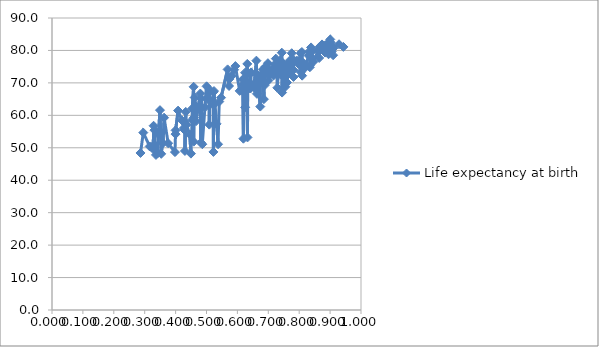
| Category | Life expectancy at birth |
|---|---|
| 0.943001086535884 | 81.097 |
| 0.928884726718224 | 81.907 |
| 0.909912675728326 | 80.734 |
| 0.909858307540323 | 78.531 |
| 0.908364866982141 | 80.654 |
| 0.908096323712948 | 81.012 |
| 0.908089883083403 | 80.557 |
| 0.905297605520119 | 79.637 |
| 0.905090521421595 | 80.414 |
| 0.90378977195844 | 81.439 |
| 0.902540799066263 | 82.338 |
| 0.900631570741602 | 83.394 |
| 0.898069322047348 | 82.759 |
| 0.897774812055868 | 81.804 |
| 0.897214078568159 | 80.642 |
| 0.894910912942129 | 78.826 |
| 0.888365794312005 | 81.618 |
| 0.88562789099183 | 80.009 |
| 0.885177302020887 | 80.854 |
| 0.884360966997406 | 81.539 |
| 0.883809164364022 | 79.341 |
| 0.882331377674584 | 79.977 |
| 0.877905058314305 | 81.404 |
| 0.873846766143105 | 81.855 |
| 0.866503886518212 | 79.963 |
| 0.866242760676353 | 81.126 |
| 0.864701973893322 | 77.685 |
| 0.863279114553869 | 80.17 |
| 0.860816377341569 | 79.915 |
| 0.845915003805726 | 76.546 |
| 0.839940590814174 | 79.591 |
| 0.838430293088418 | 80.935 |
| 0.837921636594301 | 78.005 |
| 0.834514956185372 | 74.825 |
| 0.834439395362153 | 75.446 |
| 0.83234469840887 | 79.634 |
| 0.830948107879995 | 78.371 |
| 0.816265019871938 | 74.414 |
| 0.813321137084468 | 76.126 |
| 0.809540154504943 | 72.231 |
| 0.808677034412609 | 79.499 |
| 0.806403896397662 | 75.057 |
| 0.805309471427032 | 73.339 |
| 0.804710727953276 | 79.12 |
| 0.797208111158604 | 75.901 |
| 0.795544592540491 | 76.64 |
| 0.792580746805825 | 76.835 |
| 0.783039513384962 | 77.005 |
| 0.781566472503254 | 71.826 |
| 0.781124659884953 | 73.979 |
| 0.775831300730764 | 79.143 |
| 0.773478182151098 | 73.58 |
| 0.771335878112686 | 75.62 |
| 0.771314826278731 | 74.573 |
| 0.770760886878268 | 73.371 |
| 0.770358985218947 | 73.911 |
| 0.770005793680993 | 76.954 |
| 0.768380256842546 | 76.128 |
| 0.766486825569301 | 74.522 |
| 0.76424241192356 | 72.633 |
| 0.760517336915895 | 74.221 |
| 0.760422143161092 | 70.124 |
| 0.760272015548869 | 74.576 |
| 0.759530224894331 | 74.788 |
| 0.756448264067552 | 70.349 |
| 0.755319150926532 | 68.823 |
| 0.747751685689505 | 75.956 |
| 0.744669215586354 | 67.017 |
| 0.743638247066983 | 79.311 |
| 0.739123964445273 | 76.918 |
| 0.738674542134832 | 72.64 |
| 0.735352452009181 | 73.127 |
| 0.735071155869447 | 74.402 |
| 0.733293047532656 | 75.67 |
| 0.733143667480204 | 73.737 |
| 0.729218012527663 | 68.494 |
| 0.728218279862888 | 73.373 |
| 0.728171852195352 | 74.847 |
| 0.727304809596108 | 73.127 |
| 0.724720264886485 | 73.99 |
| 0.724344667058167 | 77.477 |
| 0.722879329036045 | 74.641 |
| 0.720139435865609 | 75.632 |
| 0.717946169342195 | 73.488 |
| 0.717113342159647 | 72.283 |
| 0.716418479176017 | 74.241 |
| 0.709878723616397 | 73.703 |
| 0.70742819460444 | 72.974 |
| 0.705165809867494 | 72.974 |
| 0.703941838779668 | 72.317 |
| 0.700203476881122 | 70.739 |
| 0.699139948966322 | 73.979 |
| 0.698822150568482 | 76.072 |
| 0.698482214727031 | 74.515 |
| 0.697917977569615 | 73.403 |
| 0.697627132180494 | 73.131 |
| 0.690566290194493 | 74.941 |
| 0.688644635369459 | 73.396 |
| 0.688445116628209 | 72.444 |
| 0.688045734564413 | 69.245 |
| 0.687138373856574 | 73.456 |
| 0.685776586420752 | 64.986 |
| 0.682050815443404 | 74.126 |
| 0.679801184357862 | 70.563 |
| 0.674303636156315 | 72.196 |
| 0.674079086809316 | 62.703 |
| 0.664730385070194 | 72.477 |
| 0.663390113581774 | 66.618 |
| 0.661497534026224 | 76.848 |
| 0.653161553580443 | 68.498 |
| 0.648703503441314 | 69.317 |
| 0.644296285154165 | 68.749 |
| 0.644039788356389 | 73.235 |
| 0.641492055702589 | 72.832 |
| 0.640730987321477 | 68.287 |
| 0.636171069395425 | 68.978 |
| 0.633181814906871 | 69.927 |
| 0.632671558268572 | 53.183 |
| 0.631990867644627 | 75.85 |
| 0.625058017782409 | 62.465 |
| 0.624766973724406 | 73.126 |
| 0.623603015403771 | 68.11 |
| 0.619393676534398 | 52.797 |
| 0.617436598191192 | 69.366 |
| 0.617017954096968 | 71.017 |
| 0.615142501130284 | 67.714 |
| 0.607330958018901 | 67.529 |
| 0.593461054560543 | 75.181 |
| 0.589283982716907 | 74.044 |
| 0.581698037818783 | 72.15 |
| 0.573821398798446 | 71.172 |
| 0.572924955080361 | 69.042 |
| 0.56831798638333 | 74.156 |
| 0.547040050658691 | 65.438 |
| 0.541246347068079 | 64.228 |
| 0.537435608817837 | 51.088 |
| 0.532570137381583 | 57.379 |
| 0.52428451908968 | 67.484 |
| 0.522572011412252 | 63.125 |
| 0.522416565544592 | 48.718 |
| 0.521797296999316 | 67.185 |
| 0.510219545159499 | 67.852 |
| 0.509016709144302 | 57.134 |
| 0.508531509070331 | 64.666 |
| 0.504310304662484 | 65.437 |
| 0.50033960615702 | 68.944 |
| 0.494926837958987 | 62.475 |
| 0.486445890008691 | 51.093 |
| 0.482827600669248 | 65.193 |
| 0.481780895249997 | 51.61 |
| 0.480011802649677 | 66.718 |
| 0.466200546399786 | 58.199 |
| 0.46568719545245 | 62.791 |
| 0.461857681037788 | 65.493 |
| 0.459430134814979 | 59.318 |
| 0.458569482901503 | 51.879 |
| 0.458310921306004 | 68.795 |
| 0.453876230375213 | 62.095 |
| 0.453344630478394 | 58.582 |
| 0.449647199745084 | 48.196 |
| 0.445849319393207 | 54.116 |
| 0.435004471892684 | 57.062 |
| 0.432833616380684 | 61.061 |
| 0.43020864562156 | 49.025 |
| 0.42991789055245 | 57.937 |
| 0.429135718129872 | 55.442 |
| 0.426831994661789 | 56.081 |
| 0.419986134264031 | 58.491 |
| 0.408126051297332 | 61.452 |
| 0.399960620407204 | 55.377 |
| 0.39977897034903 | 54.21 |
| 0.397896944965925 | 48.673 |
| 0.375977023961392 | 51.384 |
| 0.362757836027566 | 59.274 |
| 0.359359233806294 | 51.444 |
| 0.353437385391095 | 48.132 |
| 0.349459797998073 | 61.597 |
| 0.34447181255486 | 54.097 |
| 0.342682660704565 | 48.398 |
| 0.336455604197499 | 47.794 |
| 0.331423290408846 | 55.439 |
| 0.32873523333842 | 56.786 |
| 0.327620042304023 | 49.553 |
| 0.32154013062414 | 50.239 |
| 0.316154080714771 | 50.411 |
| 0.295499655671891 | 54.675 |
| 0.286439754278906 | 48.397 |